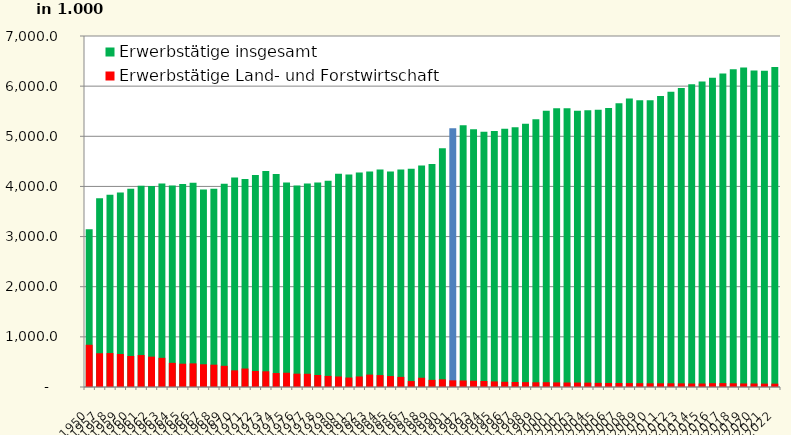
| Category | Erwerbstätige insgesamt | Erwerbstätige Land- und Forstwirtschaft |
|---|---|---|
| 1950.0 | 3146 | 842.3 |
| 1957.0 | 3762 | 673 |
| 1958.0 | 3833.2 | 676.6 |
| 1959.0 | 3879.5 | 657.8 |
| 1960.0 | 3955.4 | 618.9 |
| 1961.0 | 4013.2 | 636.9 |
| 1962.0 | 4008.2 | 605.3 |
| 1963.0 | 4060.7 | 581.5 |
| 1964.0 | 4017.2 | 481.7 |
| 1965.0 | 4049.2 | 465 |
| 1966.0 | 4075.8 | 471.1 |
| 1967.0 | 3941.1 | 453.2 |
| 1968.0 | 3952.5 | 445.1 |
| 1969.0 | 4052.8 | 422.5 |
| 1970.0 | 4176.1 | 331.8 |
| 1971.0 | 4148.1 | 368.4 |
| 1972.0 | 4230.1 | 318.9 |
| 1973.0 | 4305.8 | 313.7 |
| 1974.0 | 4246.7 | 278.4 |
| 1975.0 | 4077.8 | 284.2 |
| 1976.0 | 4017.5 | 265.9 |
| 1977.0 | 4058.4 | 264 |
| 1978.0 | 4076.6 | 239.9 |
| 1979.0 | 4111.8 | 221.3 |
| 1980.0 | 4251.1 | 209.7 |
| 1981.0 | 4238.1 | 189.1 |
| 1982.0 | 4280.1 | 210 |
| 1983.0 | 4296 | 247 |
| 1984.0 | 4339.1 | 237.3 |
| 1985.0 | 4298.6 | 218.2 |
| 1986.0 | 4336.3 | 201.9 |
| 1987.0 | 4354.7 | 118.6 |
| 1988.0 | 4414.9 | 184.6 |
| 1989.0 | 4447 | 142.5 |
| 1990.0 | 4759.1 | 153.9 |
| 1991.0 | 5162.6 | 132.9 |
| 1992.0 | 5219.3 | 129.8 |
| 1993.0 | 5138.2 | 125.3 |
| 1994.0 | 5092.6 | 120.4 |
| 1995.0 | 5104.3 | 111.4 |
| 1996.0 | 5152.3 | 104 |
| 1997.0 | 5180.4 | 99.7 |
| 1998.0 | 5252.1 | 96.9 |
| 1999.0 | 5342.2 | 94.5 |
| 2000.0 | 5509.3 | 95.4 |
| 2001.0 | 5556.7 | 91.6 |
| 2002.0 | 5558.9 | 89.4 |
| 2003.0 | 5507 | 88.6 |
| 2004.0 | 5520.9 | 87 |
| 2005.0 | 5527.8 | 82.8 |
| 2006.0 | 5563.4 | 80.5 |
| 2007.0 | 5659.6 | 79.4 |
| 2008.0 | 5752.5 | 78.1 |
| 2009.0 | 5718.5 | 76.1 |
| 2010.0 | 5720.1 | 73.7 |
| 2011.0 | 5802.6 | 73.6 |
| 2012.0 | 5888.2 | 73.7 |
| 2013.0 | 5963.2 | 72.6 |
| 2014.0 | 6039.9 | 69.7 |
| 2015.0 | 6090.6 | 69.8 |
| 2016.0 | 6167.3 | 76 |
| 2017.0 | 6252.4 | 77.3 |
| 2018.0 | 6338.9 | 74.1 |
| 2019.0 | 6372.7 | 70.8 |
| 2020.0 | 6309.7 | 69.7 |
| 2021.0 | 6308.7 | 67.5 |
| 2022.0 | 6384.1 | 66.9 |